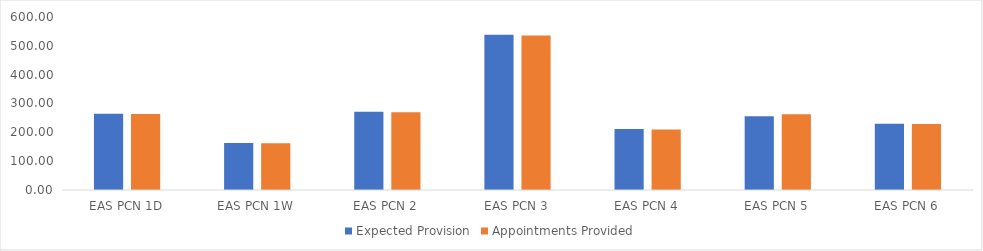
| Category | Expected Provision | Appointments Provided |
|---|---|---|
| EAS PCN 1D | 264.55 | 264 |
| EAS PCN 1W | 162.883 | 162 |
| EAS PCN 2 | 271.023 | 270 |
| EAS PCN 3 | 538.545 | 536 |
| EAS PCN 4 | 211.179 | 210 |
| EAS PCN 5 | 256.145 | 263 |
| EAS PCN 6 | 229.675 | 229 |